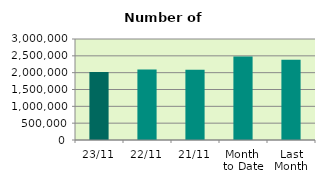
| Category | Series 0 |
|---|---|
| 23/11 | 2022750 |
| 22/11 | 2091006 |
| 21/11 | 2083926 |
| Month 
to Date | 2482528.353 |
| Last
Month | 2382963.143 |